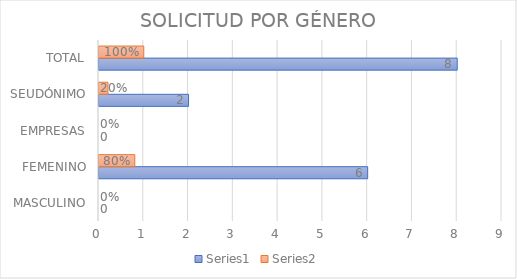
| Category | Series 0 | Series 1 |
|---|---|---|
| MASCULINO | 0 | 0 |
| FEMENINO | 6 | 0.8 |
| EMPRESAS | 0 | 0 |
| SEUDÓNIMO | 2 | 0.2 |
| TOTAL | 8 | 1 |